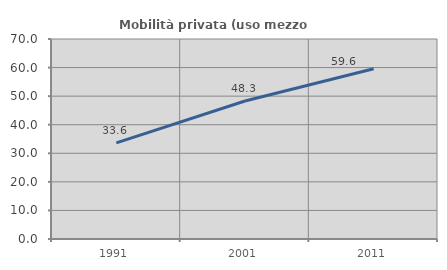
| Category | Mobilità privata (uso mezzo privato) |
|---|---|
| 1991.0 | 33.644 |
| 2001.0 | 48.31 |
| 2011.0 | 59.599 |